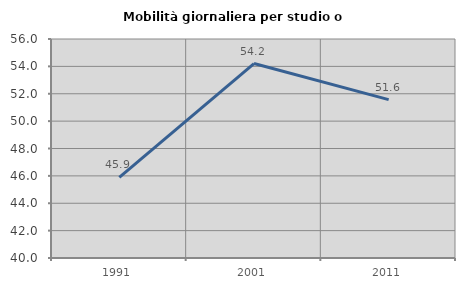
| Category | Mobilità giornaliera per studio o lavoro |
|---|---|
| 1991.0 | 45.883 |
| 2001.0 | 54.207 |
| 2011.0 | 51.574 |